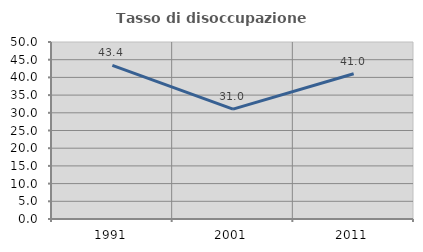
| Category | Tasso di disoccupazione giovanile  |
|---|---|
| 1991.0 | 43.396 |
| 2001.0 | 31.034 |
| 2011.0 | 41.026 |